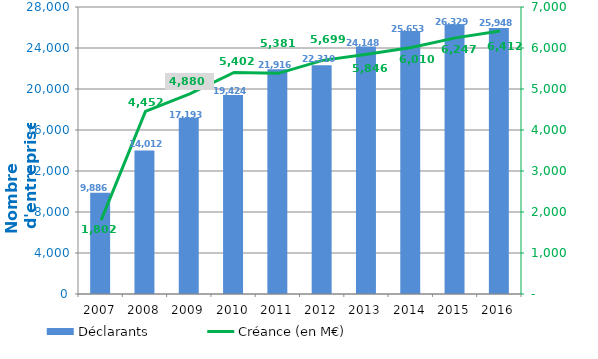
| Category | Déclarants |
|---|---|
| 2007.0 | 9886 |
| 2008.0 | 14012 |
| 2009.0 | 17193 |
| 2010.0 | 19424 |
| 2011.0 | 21916 |
| 2012.0 | 22310 |
| 2013.0 | 24148 |
| 2014.0 | 25653 |
| 2015.0 | 26329 |
| 2016.0 | 25948 |